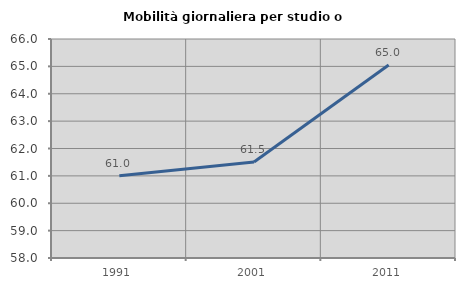
| Category | Mobilità giornaliera per studio o lavoro |
|---|---|
| 1991.0 | 61.001 |
| 2001.0 | 61.504 |
| 2011.0 | 65.047 |